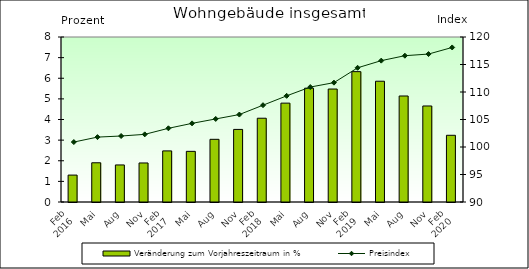
| Category | Veränderung zum Vorjahreszeitraum in % |
|---|---|
| 0 | 1.305 |
| 1 | 1.902 |
| 2 | 1.796 |
| 3 | 1.892 |
| 4 | 2.478 |
| 5 | 2.456 |
| 6 | 3.039 |
| 7 | 3.519 |
| 8 | 4.062 |
| 9 | 4.794 |
| 10 | 5.519 |
| 11 | 5.477 |
| 12 | 6.32 |
| 13 | 5.855 |
| 14 | 5.14 |
| 15 | 4.655 |
| 16 | 3.234 |